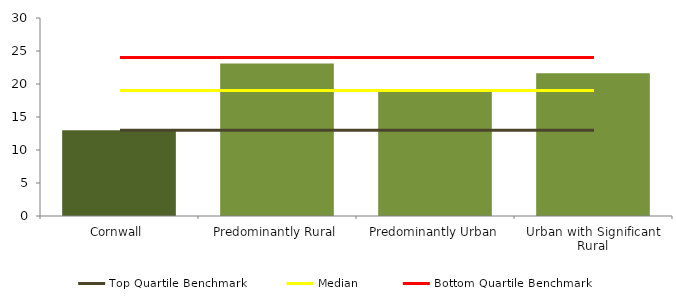
| Category | Series 0 |
|---|---|
| Cornwall | 13 |
| Predominantly Rural | 23.1 |
| Predominantly Urban | 18.917 |
| Urban with Significant Rural | 21.636 |